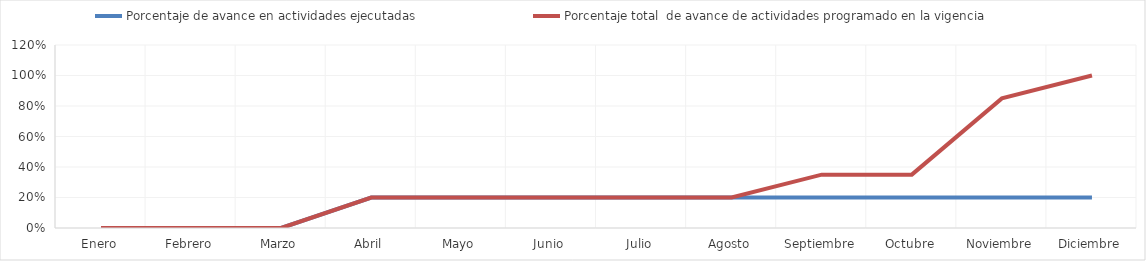
| Category | Porcentaje de avance en actividades ejecutadas | Porcentaje total  de avance de actividades programado en la vigencia |
|---|---|---|
| 0 | 0 | 0 |
| 1 | 0 | 0 |
| 2 | 0 | 0 |
| 3 | 0.2 | 0.2 |
| 4 | 0.2 | 0.2 |
| 5 | 0.2 | 0.2 |
| 6 | 0.2 | 0.2 |
| 7 | 0.2 | 0.2 |
| 8 | 0.2 | 0.35 |
| 9 | 0.2 | 0.35 |
| 10 | 0.2 | 0.85 |
| 11 | 0.2 | 1 |